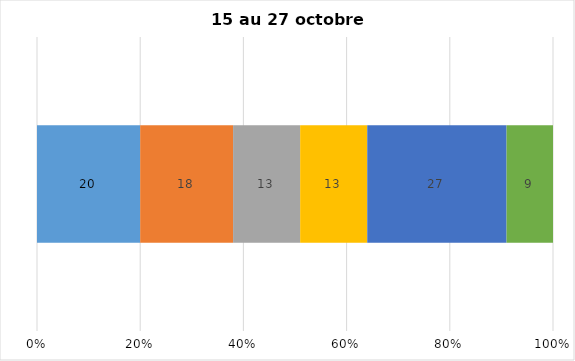
| Category | Plusieurs fois par jour | Une fois par jour | Quelques fois par semaine   | Une fois par semaine ou moins   |  Jamais   |  Je n’utilise pas les médias sociaux |
|---|---|---|---|---|---|---|
| 0 | 20 | 18 | 13 | 13 | 27 | 9 |